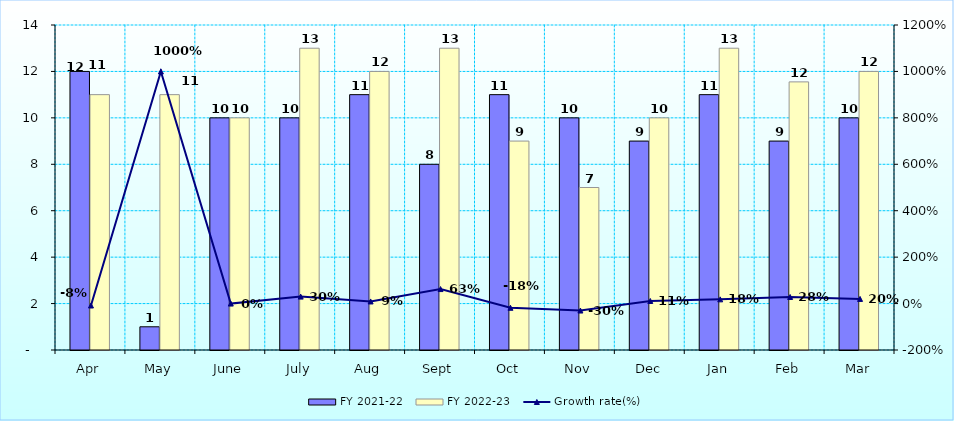
| Category | FY 2021-22 | FY 2022-23 |
|---|---|---|
| Apr | 12 | 11 |
| May | 1 | 11 |
| June | 10 | 10 |
| July | 10 | 13 |
| Aug | 11 | 12 |
| Sept | 8 | 13 |
| Oct | 11 | 9 |
| Nov | 10 | 7 |
| Dec | 9 | 10 |
| Jan | 11 | 13 |
| Feb | 9 | 11.55 |
| Mar | 10 | 12 |